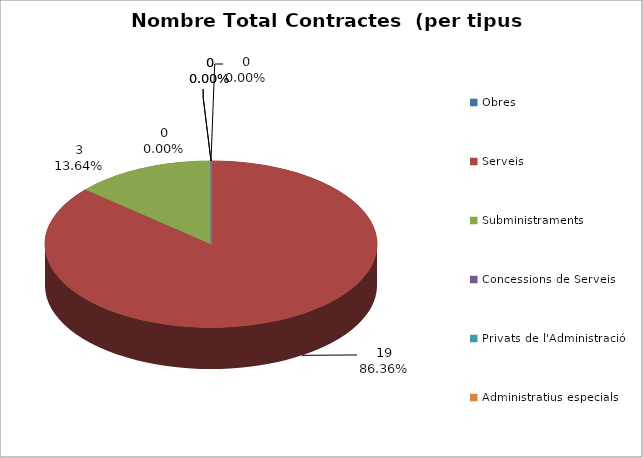
| Category | Nombre Total Contractes |
|---|---|
| Obres | 0 |
| Serveis | 19 |
| Subministraments | 3 |
| Concessions de Serveis | 0 |
| Privats de l'Administració | 0 |
| Administratius especials | 0 |